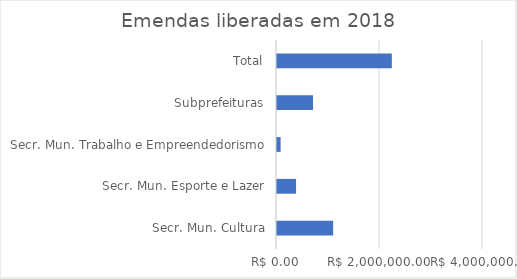
| Category | Series 0 |
|---|---|
| Secr. Mun. Cultura | 1090000 |
| Secr. Mun. Esporte e Lazer | 370000 |
| Secr. Mun. Trabalho e Empreendedorismo | 70000 |
| Subprefeituras | 700000 |
| Total | 2230000 |